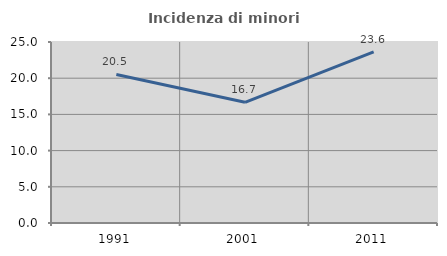
| Category | Incidenza di minori stranieri |
|---|---|
| 1991.0 | 20.513 |
| 2001.0 | 16.667 |
| 2011.0 | 23.63 |